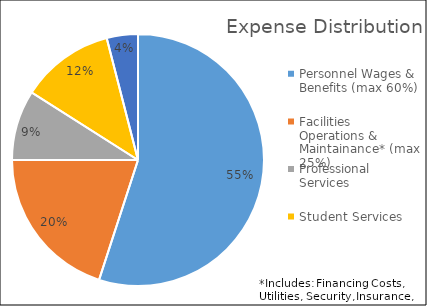
| Category | Series 0 | Series 1 |
|---|---|---|
| Personnel Wages & Benefits (max 60%) | 0.55 | 0.55 |
| Facilities Operations & Maintainance* (max 25%) | 0.2 | 0.2 |
| Professional Services | 0.09 | 0.09 |
| Student Services | 0.12 | 0.12 |
| Office Supplies, Equipment & Misc. | 0.04 | 0.04 |